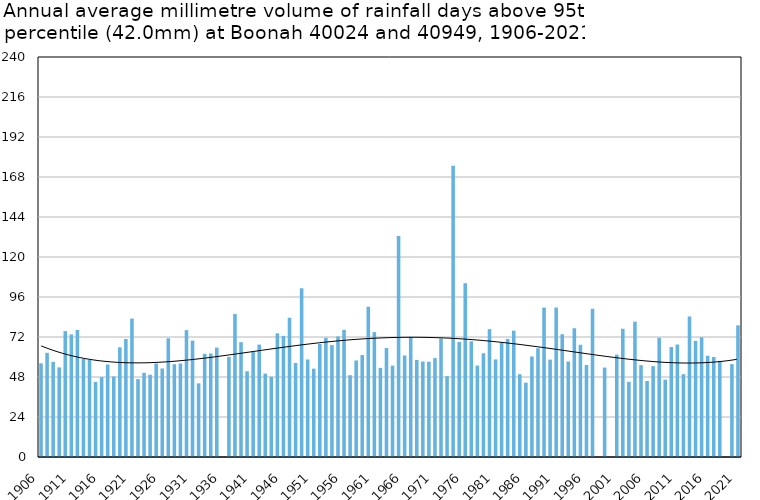
| Category | Annual average mm in days above 95th percentile |
|---|---|
| 1906 | 56.2 |
| 1907 | 62.5 |
| 1908 | 57.1 |
| 1909 | 53.8 |
| 1910 | 75.54 |
| 1911 | 73.55 |
| 1912 | 76.2 |
| 1913 | 58.8 |
| 1914 | 58.225 |
| 1915 | 45.075 |
| 1916 | 47.9 |
| 1917 | 55.5 |
| 1918 | 48.3 |
| 1919 | 65.8 |
| 1920 | 70.8 |
| 1921 | 83.05 |
| 1922 | 46.75 |
| 1923 | 50.5 |
| 1924 | 49.375 |
| 1925 | 56.067 |
| 1926 | 53.1 |
| 1927 | 71.22 |
| 1928 | 55.657 |
| 1929 | 56.1 |
| 1930 | 76.125 |
| 1931 | 69.85 |
| 1932 | 44.2 |
| 1933 | 61.875 |
| 1934 | 62.08 |
| 1935 | 65.65 |
| 1936 | 0 |
| 1937 | 60.04 |
| 1938 | 85.85 |
| 1939 | 68.88 |
| 1940 | 51.433 |
| 1941 | 63.2 |
| 1942 | 67.457 |
| 1943 | 50.05 |
| 1944 | 48.15 |
| 1945 | 74.175 |
| 1946 | 72.683 |
| 1947 | 83.538 |
| 1948 | 56.44 |
| 1949 | 101.2 |
| 1950 | 58.5 |
| 1951 | 53 |
| 1952 | 67.8 |
| 1953 | 71.533 |
| 1954 | 67.133 |
| 1955 | 72.3 |
| 1956 | 76.3 |
| 1957 | 49.075 |
| 1958 | 57.9 |
| 1959 | 61.16 |
| 1960 | 90.2 |
| 1961 | 74.95 |
| 1962 | 53.475 |
| 1963 | 65.357 |
| 1964 | 54.82 |
| 1965 | 132.6 |
| 1966 | 60.933 |
| 1967 | 72.067 |
| 1968 | 58.267 |
| 1969 | 57.3 |
| 1970 | 57.175 |
| 1971 | 59.317 |
| 1972 | 71.08 |
| 1973 | 48.5 |
| 1974 | 174.733 |
| 1975 | 69 |
| 1976 | 104.25 |
| 1977 | 69.4 |
| 1978 | 54.85 |
| 1979 | 62.267 |
| 1980 | 76.733 |
| 1981 | 58.556 |
| 1982 | 68.717 |
| 1983 | 70.88 |
| 1984 | 75.8 |
| 1985 | 49.667 |
| 1986 | 44.6 |
| 1987 | 60.32 |
| 1988 | 65.25 |
| 1989 | 89.64 |
| 1990 | 58.4 |
| 1991 | 89.675 |
| 1992 | 73.65 |
| 1993 | 57.3 |
| 1994 | 77.2 |
| 1995 | 67.333 |
| 1996 | 55.16 |
| 1997 | 89 |
| 1998 | 0 |
| 1999 | 53.65 |
| 2000 | 0 |
| 2001 | 61.45 |
| 2002 | 76.933 |
| 2003 | 45.1 |
| 2004 | 81.2 |
| 2005 | 55.1 |
| 2006 | 45.6 |
| 2007 | 54.5 |
| 2008 | 71.5 |
| 2009 | 46.4 |
| 2010 | 66 |
| 2011 | 67.5 |
| 2012 | 49.667 |
| 2013 | 84.333 |
| 2014 | 69.667 |
| 2015 | 71.8 |
| 2016 | 60.75 |
| 2017 | 60 |
| 2018 | 57.667 |
| 2019 | 0 |
| 2020 | 55.75 |
| 2021 | 79 |